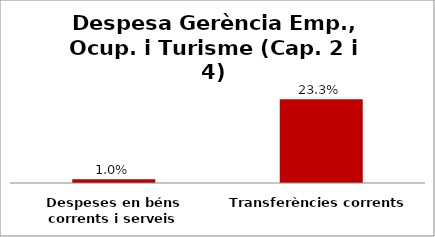
| Category | Series 0 |
|---|---|
| Despeses en béns corrents i serveis | 0.01 |
| Transferències corrents | 0.233 |